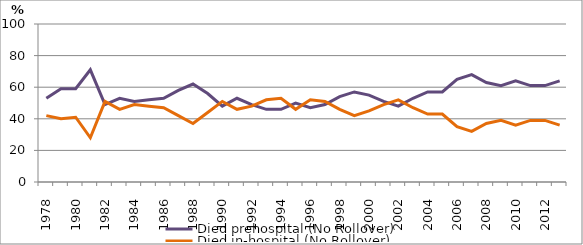
| Category | Died prehospital (No Rollover) | Died in-hospital (No Rollover) |
|---|---|---|
| 1978.0 | 53 | 42 |
| 1979.0 | 59 | 40 |
| 1980.0 | 59 | 41 |
| 1981.0 | 71 | 28 |
| 1982.0 | 49 | 51 |
| 1983.0 | 53 | 46 |
| 1984.0 | 51 | 49 |
| 1985.0 | 52 | 48 |
| 1986.0 | 53 | 47 |
| 1987.0 | 58 | 42 |
| 1988.0 | 62 | 37 |
| 1989.0 | 56 | 44 |
| 1990.0 | 48 | 51 |
| 1991.0 | 53 | 46 |
| 1992.0 | 49 | 48 |
| 1993.0 | 46 | 52 |
| 1994.0 | 46 | 53 |
| 1995.0 | 50 | 46 |
| 1996.0 | 47 | 52 |
| 1997.0 | 49 | 51 |
| 1998.0 | 54 | 46 |
| 1999.0 | 57 | 42 |
| 2000.0 | 55 | 45 |
| 2001.0 | 51 | 49 |
| 2002.0 | 48 | 52 |
| 2003.0 | 53 | 47 |
| 2004.0 | 57 | 43 |
| 2005.0 | 57 | 43 |
| 2006.0 | 65 | 35 |
| 2007.0 | 68 | 32 |
| 2008.0 | 63 | 37 |
| 2009.0 | 61 | 39 |
| 2010.0 | 64 | 36 |
| 2011.0 | 61 | 39 |
| 2012.0 | 61 | 39 |
| 2013.0 | 64 | 36 |